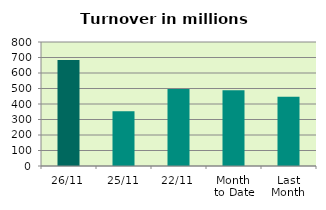
| Category | Series 0 |
|---|---|
| 26/11 | 683.624 |
| 25/11 | 352.503 |
| 22/11 | 497.024 |
| Month 
to Date | 489.069 |
| Last
Month | 446.481 |